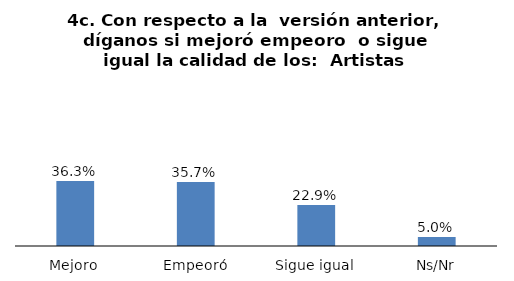
| Category | Series 0 |
|---|---|
| Mejoro | 0.363 |
| Empeoró | 0.357 |
| Sigue igual | 0.229 |
| Ns/Nr | 0.05 |